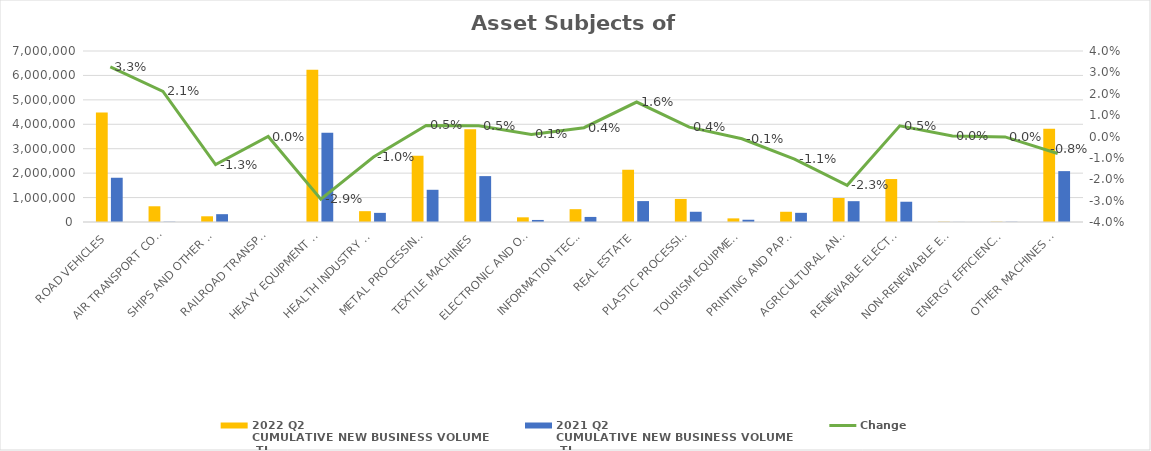
| Category | 2022 Q2 
CUMULATIVE NEW BUSINESS VOLUME
 TL | 2021 Q2 
CUMULATIVE NEW BUSINESS VOLUME
 TL |
|---|---|---|
| ROAD VEHICLES | 4481193.914 | 1811135.997 |
| AIR TRANSPORT CONVEYANCE | 643885 | 11001 |
| SHIPS AND OTHER SEA-GOING VESSELS | 233742.45 | 320305.586 |
| RAILROAD TRANSPORT VEHICLES | 0 | 0 |
| HEAVY EQUIPMENT AND CONSTRUCTION MACHINERY | 6234107.619 | 3653356.123 |
| HEALTH INDUSTRY AND AESTHETIC INSTRUMENTS | 443301.291 | 373993.543 |
| METAL PROCESSING MACHINE | 2715534.944 | 1318756.467 |
| TEXTILE MACHINES | 3799704.912 | 1878793.638 |
| ELECTRONIC AND OPTICAL DEVICES | 191675.012 | 83696.658 |
| INFORMATION TECHNOLOGIES AND OFFICE SYSTEMS | 524994.362 | 207586.785 |
| REAL ESTATE | 2139214.991 | 856050.224 |
| PLASTIC PROCESSING MACHINES | 943798.476 | 419024.727 |
| TOURISM EQUIPMENT | 148371.059 | 92221.875 |
| PRINTING AND PAPER PROCESSING MACHINES | 418984.242 | 375645.664 |
| AGRICULTURAL AND LIVESTOCK FARMING MACHINES | 982892.781 | 852567.645 |
| RENEWABLE ELECTRICITY GENERATION | 1758627.274 | 829377.181 |
| NON-RENEWABLE ELECTRIC ENERGY GENERATION | 11337 | 2857 |
| ENERGY EFFICIENCY EQUIPMENT | 11273.342 | 8548.692 |
| OTHER MACHINES AND EQUIPMENT | 3812181.107 | 2082720.629 |